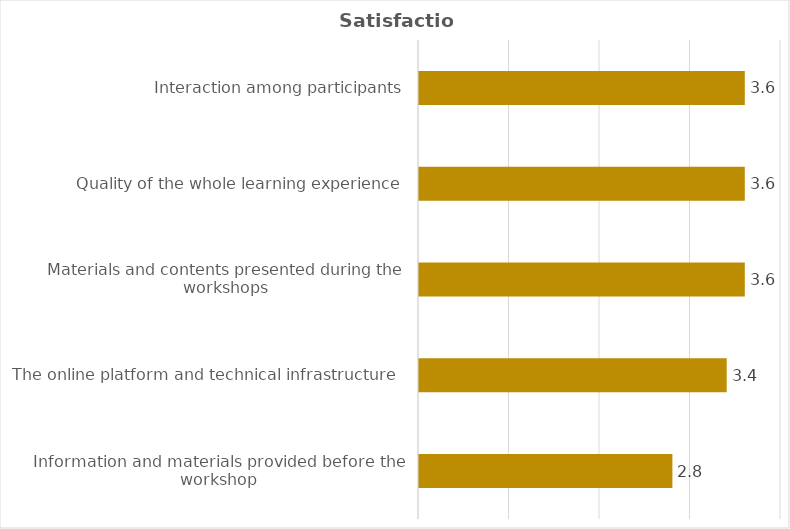
| Category | Series 0 |
|---|---|
| Information and materials provided before the workshop | 2.8 |
| The online platform and technical infrastructure  | 3.4 |
| Materials and contents presented during the workshops | 3.6 |
| Quality of the whole learning experience | 3.6 |
| Interaction among participants | 3.6 |